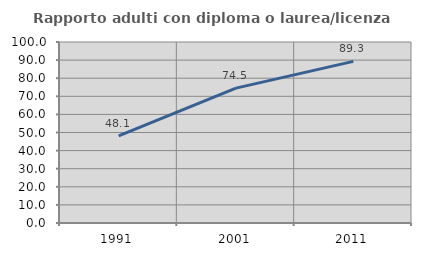
| Category | Rapporto adulti con diploma o laurea/licenza media  |
|---|---|
| 1991.0 | 48.077 |
| 2001.0 | 74.519 |
| 2011.0 | 89.299 |